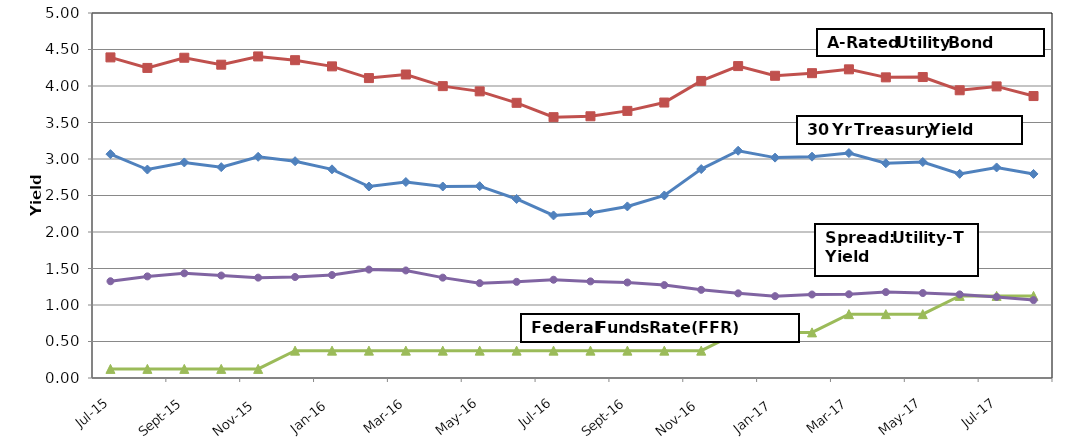
| Category | Treasury Yield | A-Rated Utility Bond | Target Federal Funds Rate Range Midpoint | Spread |
|---|---|---|---|---|
| 2015-07-01 | 3.066 | 4.392 | 0.125 | 1.326 |
| 2015-08-01 | 2.856 | 4.248 | 0.125 | 1.392 |
| 2015-09-01 | 2.953 | 4.387 | 0.125 | 1.434 |
| 2015-10-01 | 2.888 | 4.292 | 0.125 | 1.404 |
| 2015-11-01 | 3.03 | 4.405 | 0.125 | 1.375 |
| 2015-12-01 | 2.97 | 4.354 | 0.375 | 1.384 |
| 2016-01-01 | 2.858 | 4.269 | 0.375 | 1.411 |
| 2016-02-01 | 2.623 | 4.108 | 0.375 | 1.486 |
| 2016-03-01 | 2.685 | 4.158 | 0.375 | 1.473 |
| 2016-04-01 | 2.623 | 3.998 | 0.375 | 1.375 |
| 2016-05-01 | 2.628 | 3.927 | 0.375 | 1.299 |
| 2016-06-01 | 2.452 | 3.77 | 0.375 | 1.317 |
| 2016-07-01 | 2.227 | 3.573 | 0.375 | 1.346 |
| 2016-08-01 | 2.262 | 3.585 | 0.375 | 1.323 |
| 2016-09-01 | 2.35 | 3.659 | 0.375 | 1.309 |
| 2016-10-01 | 2.5 | 3.774 | 0.375 | 1.273 |
| 2016-11-01 | 2.862 | 4.069 | 0.375 | 1.207 |
| 2016-12-01 | 3.113 | 4.273 | 0.625 | 1.16 |
| 2017-01-01 | 3.019 | 4.14 | 0.625 | 1.121 |
| 2017-02-01 | 3.032 | 4.176 | 0.625 | 1.144 |
| 2017-03-01 | 3.081 | 4.228 | 0.875 | 1.147 |
| 2017-04-01 | 2.942 | 4.118 | 0.875 | 1.177 |
| 2017-05-01 | 2.959 | 4.123 | 0.875 | 1.164 |
| 2017-06-01 | 2.796 | 3.941 | 1.125 | 1.145 |
| 2017-07-01 | 2.884 | 3.995 | 1.125 | 1.111 |
| 2017-08-01 | 2.795 | 3.862 | 1.125 | 1.067 |